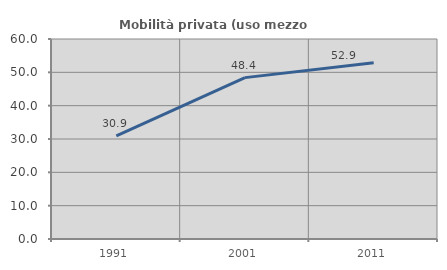
| Category | Mobilità privata (uso mezzo privato) |
|---|---|
| 1991.0 | 30.927 |
| 2001.0 | 48.413 |
| 2011.0 | 52.881 |